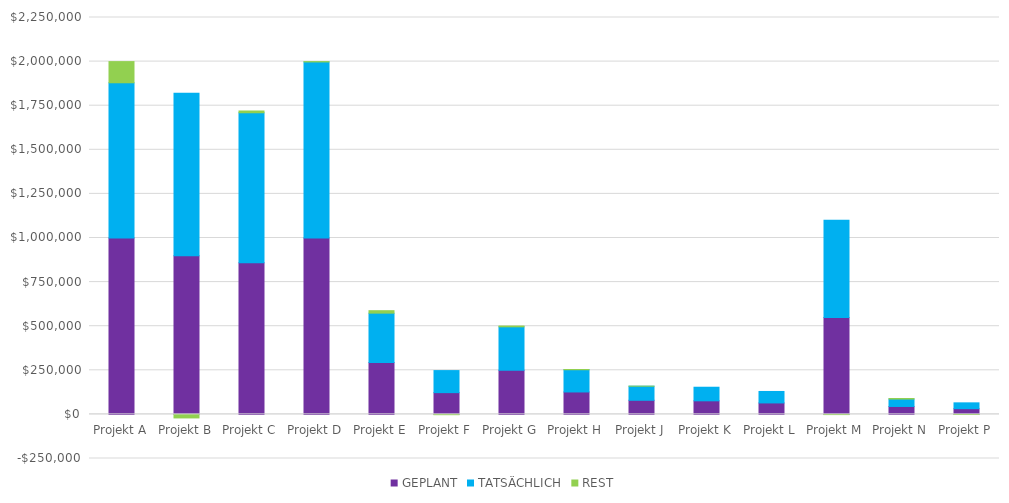
| Category | GEPLANT | TATSÄCHLICH | REST |
|---|---|---|---|
| Projekt A | 1000000 | 880000 | 120000 |
| Projekt B | 900000 | 920000 | -20000 |
| Projekt C | 860000 | 850000 | 10000 |
| Projekt D | 1000000 | 998050 | 1950 |
| Projekt E | 294000 | 280000 | 14000 |
| Projekt F | 123400 | 125000 | -1600 |
| Projekt G | 250500 | 246000 | 4500 |
| Projekt H | 127200 | 126000 | 1200 |
| Projekt J | 80000 | 79900 | 100 |
| Projekt K | 77000 | 77000 | 0 |
| Projekt L | 65000 | 65000 | 0 |
| Projekt M | 550000 | 551000 | -1000 |
| Projekt N | 45000 | 42000 | 3000 |
| Projekt P | 32500 | 33000 | -500 |